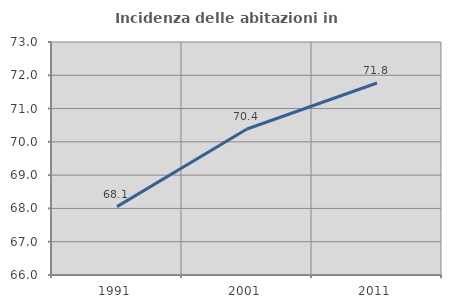
| Category | Incidenza delle abitazioni in proprietà  |
|---|---|
| 1991.0 | 68.054 |
| 2001.0 | 70.386 |
| 2011.0 | 71.768 |